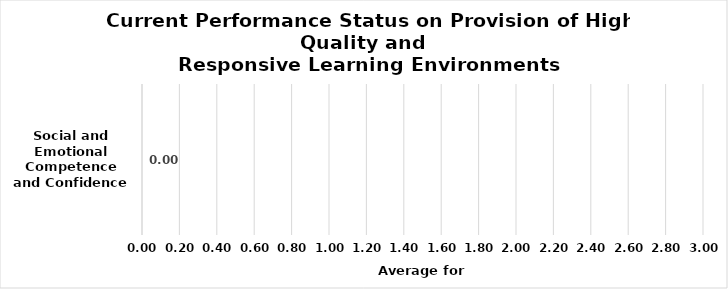
| Category | Current Performance Status on
Provision of High Quality and Responsive Learning Environments |
|---|---|
| Social and Emotional Competence and Confidence | 0 |